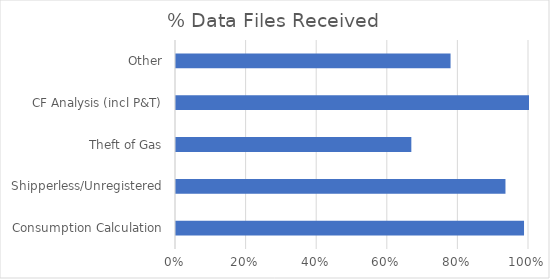
| Category | % Data Received |
|---|---|
| Consumption Calculation | 0.986 |
| Shipperless/Unregistered | 0.933 |
| Theft of Gas | 0.667 |
| CF Analysis (incl P&T) | 1 |
| Other | 0.778 |